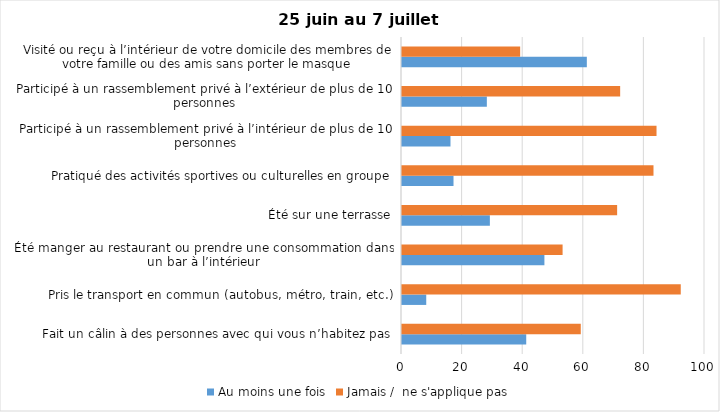
| Category | Au moins une fois | Jamais /  ne s'applique pas |
|---|---|---|
| Fait un câlin à des personnes avec qui vous n’habitez pas | 41 | 59 |
| Pris le transport en commun (autobus, métro, train, etc.) | 8 | 92 |
| Été manger au restaurant ou prendre une consommation dans un bar à l’intérieur | 47 | 53 |
| Été sur une terrasse | 29 | 71 |
| Pratiqué des activités sportives ou culturelles en groupe | 17 | 83 |
| Participé à un rassemblement privé à l’intérieur de plus de 10 personnes | 16 | 84 |
| Participé à un rassemblement privé à l’extérieur de plus de 10 personnes | 28 | 72 |
| Visité ou reçu à l’intérieur de votre domicile des membres de votre famille ou des amis sans porter le masque | 61 | 39 |